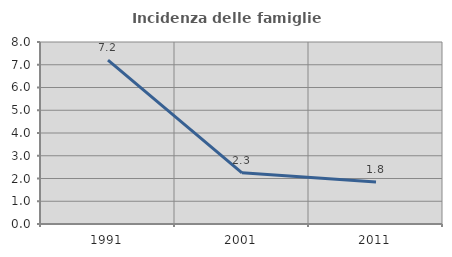
| Category | Incidenza delle famiglie numerose |
|---|---|
| 1991.0 | 7.2 |
| 2001.0 | 2.25 |
| 2011.0 | 1.848 |